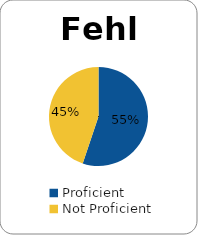
| Category | Series 0 |
|---|---|
| Proficient | 0.552 |
| Not Proficient | 0.448 |